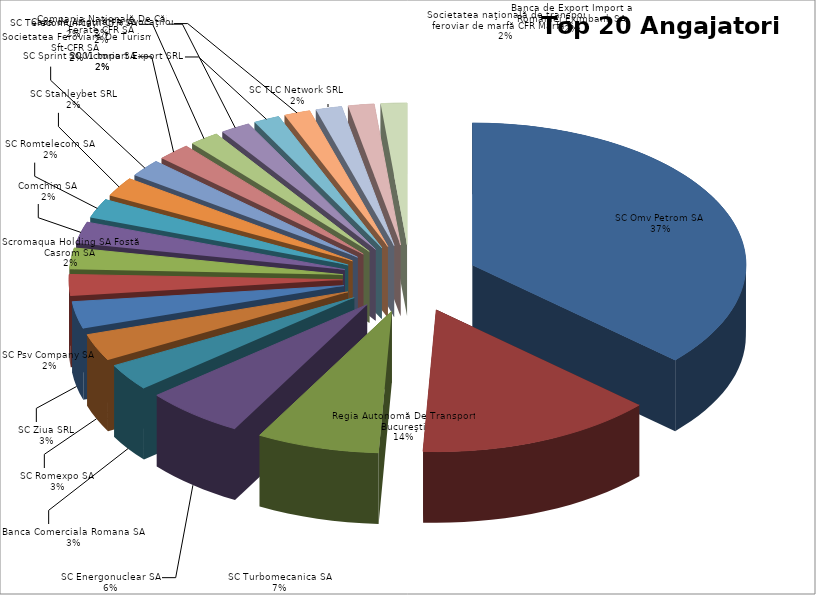
| Category | Series 0 |
|---|---|
| SC Omv Petrom SA | 167 |
| Regia Autonomă De Transport Bucureşti | 64 |
| SC Turbomecanica SA | 33 |
| SC Energonuclear SA | 27 |
| Banca Comerciala Romana SA | 14 |
| SC Romexpo SA | 14 |
| SC Ziua SRL | 14 |
| SC Psv Company SA | 11 |
| Scromaqua Holding SA Fostă Casrom SA | 11 |
| Comchim SA | 11 |
| SC Romtelecom SA | 10 |
| SC Stanleybet SRL | 10 |
| Societatea Feroviară De Turism Sft-CFR SA | 9 |
| SC Victoria SA | 9 |
| SC Telecomunicaţii CFR SA | 8 |
| Compania Naţională De Căi Ferate CFR SA | 8 |
| SC Sprint 2001 Import Export SRL | 7 |
| Casa de Asigurări a Avocaţilor | 7 |
| SC TLC Network SRL | 7 |
| Societatea naţională de transport feroviar de marfă CFR Marfă SA | 7 |
| Banca de Export Import a României Eximbank SA | 7 |